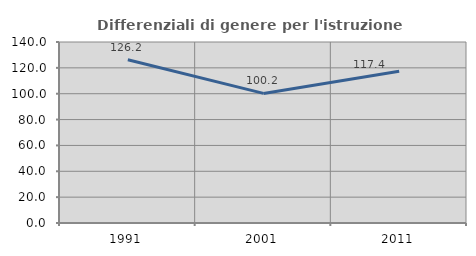
| Category | Differenziali di genere per l'istruzione superiore |
|---|---|
| 1991.0 | 126.228 |
| 2001.0 | 100.242 |
| 2011.0 | 117.425 |